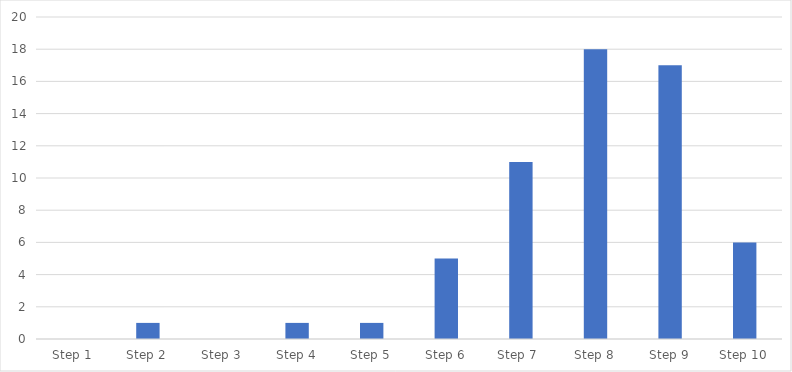
| Category | Number of Responses |
|---|---|
| Step 1 | 0 |
| Step 2 | 1 |
| Step 3 | 0 |
| Step 4 | 1 |
| Step 5 | 1 |
| Step 6 | 5 |
| Step 7  | 11 |
| Step 8 | 18 |
| Step 9 | 17 |
| Step 10 | 6 |